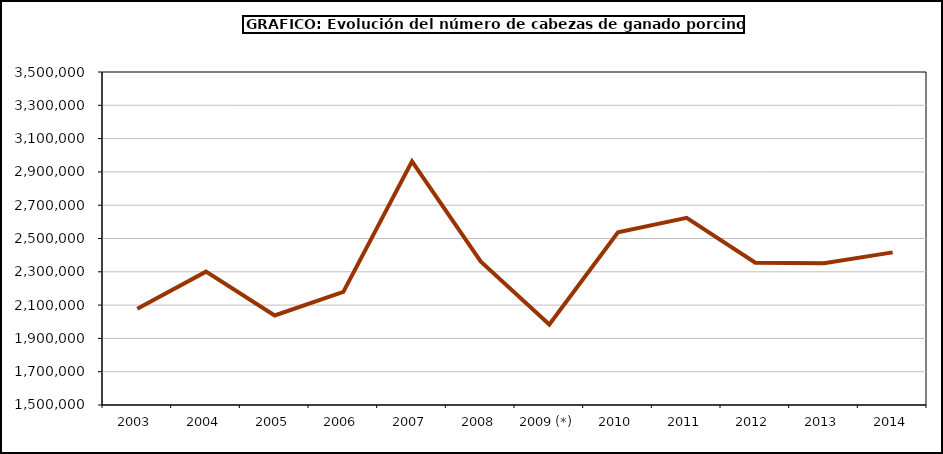
| Category | Total porcino |
|---|---|
| 2003 | 2078365 |
| 2004 | 2300819 |
| 2005 | 2037853 |
| 2006 | 2179321 |
| 2007 | 2963922.516 |
| 2008 | 2362406.6 |
| 2009 (*) | 1983218.02 |
| 2010 | 2536564 |
| 2011 | 2624006 |
| 2012 | 2354690 |
| 2013 | 2351566 |
| 2014 | 2416557.46 |